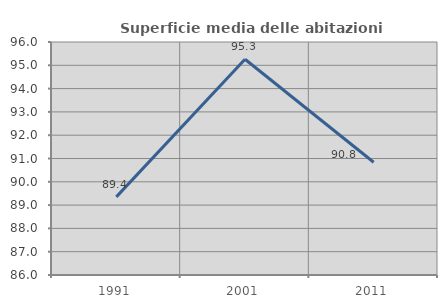
| Category | Superficie media delle abitazioni occupate |
|---|---|
| 1991.0 | 89.354 |
| 2001.0 | 95.258 |
| 2011.0 | 90.839 |